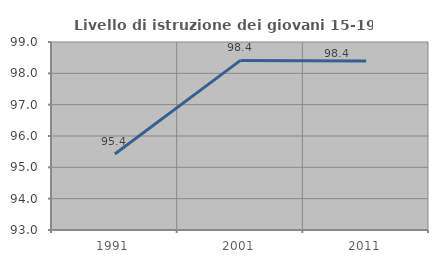
| Category | Livello di istruzione dei giovani 15-19 anni |
|---|---|
| 1991.0 | 95.425 |
| 2001.0 | 98.413 |
| 2011.0 | 98.396 |